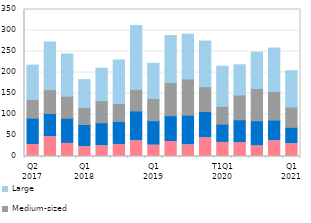
| Category | Micro | Small | Medium-sized | Large |
|---|---|---|---|---|
| Q2
2017 | 28.601 | 62.573 | 44.608 | 81.806 |
|  | 47.306 | 54.987 | 56.8 | 113.518 |
|  | 31.129 | 59.946 | 52.372 | 100.581 |
| Q1
2018 | 23.458 | 52.774 | 40.183 | 66.517 |
|  | 25.544 | 54.802 | 52.603 | 77.229 |
|  | 28.673 | 54.873 | 42.484 | 103.899 |
|  | 37.41 | 70.984 | 51.038 | 152.215 |
| Q1
2019 | 26.913 | 58.293 | 53.033 | 83.702 |
|  | 35.763 | 61.475 | 78.723 | 111.897 |
|  | 27.759 | 70.634 | 86.103 | 106.825 |
|  | 44.489 | 62.561 | 59.132 | 108.665 |
| T1Q1
2020 | 33.497 | 43.549 | 42.255 | 95.672 |
|  | 32.96 | 54.335 | 59 | 72.028 |
|  | 25.293 | 59.78 | 76.792 | 86.501 |
|  | 37.626 | 49.063 | 68.305 | 103.2 |
| Q1
2021 | 30.617 | 38.71 | 48.392 | 86.375 |